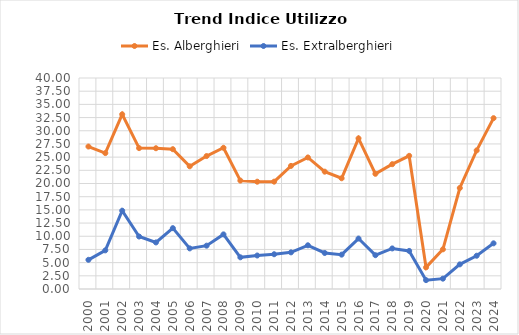
| Category | Es. Alberghieri | Es. Extralberghieri |
|---|---|---|
| 2000.0 | 27.007 | 5.532 |
| 2001.0 | 25.766 | 7.323 |
| 2002.0 | 33.113 | 14.843 |
| 2003.0 | 26.706 | 9.95 |
| 2004.0 | 26.685 | 8.828 |
| 2005.0 | 26.504 | 11.536 |
| 2006.0 | 23.26 | 7.697 |
| 2007.0 | 25.206 | 8.214 |
| 2008.0 | 26.774 | 10.354 |
| 2009.0 | 20.554 | 6.005 |
| 2010.0 | 20.341 | 6.35 |
| 2011.0 | 20.348 | 6.59 |
| 2012.0 | 23.338 | 6.947 |
| 2013.0 | 24.938 | 8.287 |
| 2014.0 | 22.242 | 6.827 |
| 2015.0 | 20.991 | 6.514 |
| 2016.0 | 28.559 | 9.564 |
| 2017.0 | 21.84 | 6.409 |
| 2018.0 | 23.662 | 7.689 |
| 2019.0 | 25.244 | 7.222 |
| 2020.0 | 4.1 | 1.682 |
| 2021.0 | 7.521 | 1.96 |
| 2022.0 | 19.146 | 4.671 |
| 2023.0 | 26.274 | 6.307 |
| 2024.0 | 32.386 | 8.658 |